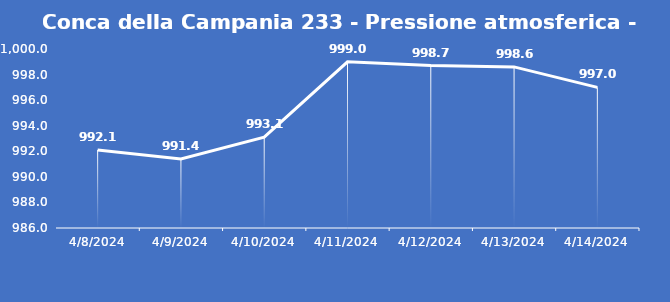
| Category | Conca della Campania 233 - Pressione atmosferica - Grezzo (hPa) |
|---|---|
| 4/8/24 | 992.1 |
| 4/9/24 | 991.4 |
| 4/10/24 | 993.1 |
| 4/11/24 | 999 |
| 4/12/24 | 998.7 |
| 4/13/24 | 998.6 |
| 4/14/24 | 997 |